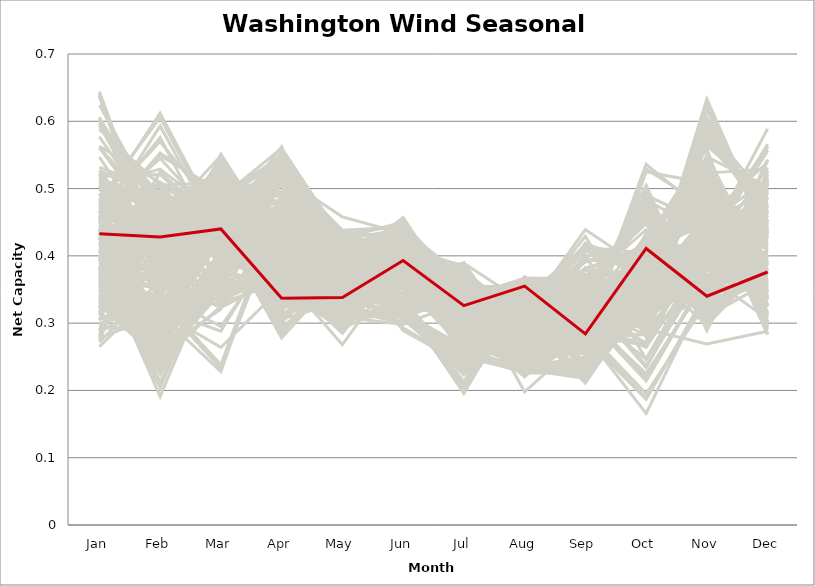
| Category | sample_001 | sample_002 | sample_003 | sample_004 | sample_005 | sample_006 | sample_007 | sample_008 | sample_009 | sample_010 | sample_011 | sample_012 | sample_013 | sample_014 | sample_015 | sample_016 | sample_017 | sample_018 | sample_019 | sample_020 | sample_021 | sample_022 | sample_023 | sample_024 | sample_025 | sample_026 | sample_027 | sample_028 | sample_029 | sample_030 | sample_031 | sample_032 | sample_033 | sample_034 | sample_035 | sample_036 | sample_037 | sample_038 | sample_039 | sample_040 | sample_041 | sample_042 | sample_043 | sample_044 | sample_045 | sample_046 | sample_047 | sample_048 | sample_049 | sample_050 | sample_051 | sample_052 | sample_053 | sample_054 | sample_055 | sample_056 | sample_057 | sample_058 | sample_059 | sample_060 | sample_061 | sample_062 | sample_063 | sample_064 | sample_065 | sample_066 | sample_067 | sample_068 | sample_069 | sample_070 | sample_071 | sample_072 | sample_073 | sample_074 | sample_075 | sample_076 | sample_077 | sample_078 | sample_079 | sample_080 | sample_081 | sample_082 | sample_083 | sample_084 | sample_085 | sample_086 | sample_087 | sample_088 | sample_089 | sample_090 | sample_091 | sample_092 | sample_093 | sample_094 | sample_095 | sample_096 | sample_097 | sample_098 | sample_099 | sample_100 | sample_101 | sample_102 | sample_103 | sample_104 | sample_105 | sample_106 | sample_107 | sample_108 | sample_109 | sample_110 | sample_111 | sample_112 | sample_113 | sample_114 | sample_115 | sample_116 | sample_117 | sample_118 | sample_119 | sample_120 | sample_121 | sample_122 | sample_123 | sample_124 | sample_125 | sample_126 | sample_127 | sample_128 | sample_129 | sample_130 | sample_131 | sample_132 | sample_133 | sample_134 | sample_135 | sample_136 | sample_137 | sample_138 | sample_139 | sample_140 | sample_141 | sample_142 | sample_143 | sample_144 | sample_145 | sample_146 | sample_147 | sample_148 | sample_149 | sample_150 | sample_151 | sample_152 | sample_153 | sample_154 | sample_155 | sample_156 | sample_157 | sample_158 | sample_159 | sample_160 | sample_161 | sample_162 | sample_163 | sample_164 | sample_165 | sample_166 | sample_167 | sample_168 | sample_169 | sample_170 | sample_171 | sample_172 | sample_173 | sample_174 | sample_175 | sample_176 | sample_177 | sample_178 | sample_179 | sample_180 | sample_181 | sample_182 | sample_183 | sample_184 | sample_185 | sample_186 | sample_187 | sample_188 | sample_189 | sample_190 | sample_191 | sample_192 | sample_193 | sample_194 | sample_195 | sample_196 | sample_197 | sample_198 | sample_199 | sample_200 | sample_201 | sample_202 | sample_203 | sample_204 | sample_205 | sample_206 | sample_207 | sample_208 | sample_209 | sample_210 | sample_211 | sample_212 | sample_213 | sample_214 | sample_215 | sample_216 | sample_217 | sample_218 | sample_219 | sample_220 | sample_221 | sample_222 | sample_223 | sample_224 | sample_225 | sample_226 | sample_227 | sample_228 | sample_229 | sample_230 | sample_231 | sample_232 | sample_233 | sample_234 | sample_235 | sample_236 | sample_237 | sample_238 | sample_239 | sample_240 | sample_241 | sample_242 | sample_243 | sample_244 | sample_245 | sample_246 | sample_247 | sample_248 | sample_250 | sample_249 |
|---|---|---|---|---|---|---|---|---|---|---|---|---|---|---|---|---|---|---|---|---|---|---|---|---|---|---|---|---|---|---|---|---|---|---|---|---|---|---|---|---|---|---|---|---|---|---|---|---|---|---|---|---|---|---|---|---|---|---|---|---|---|---|---|---|---|---|---|---|---|---|---|---|---|---|---|---|---|---|---|---|---|---|---|---|---|---|---|---|---|---|---|---|---|---|---|---|---|---|---|---|---|---|---|---|---|---|---|---|---|---|---|---|---|---|---|---|---|---|---|---|---|---|---|---|---|---|---|---|---|---|---|---|---|---|---|---|---|---|---|---|---|---|---|---|---|---|---|---|---|---|---|---|---|---|---|---|---|---|---|---|---|---|---|---|---|---|---|---|---|---|---|---|---|---|---|---|---|---|---|---|---|---|---|---|---|---|---|---|---|---|---|---|---|---|---|---|---|---|---|---|---|---|---|---|---|---|---|---|---|---|---|---|---|---|---|---|---|---|---|---|---|---|---|---|---|---|---|---|---|---|---|---|---|---|---|---|---|---|---|---|---|---|---|---|---|---|---|---|---|---|
| Jan | 0.468 | 0.458 | 0.605 | 0.367 | 0.527 | 0.448 | 0.451 | 0.355 | 0.475 | 0.392 | 0.601 | 0.457 | 0.377 | 0.64 | 0.376 | 0.362 | 0.279 | 0.296 | 0.37 | 0.577 | 0.398 | 0.455 | 0.36 | 0.407 | 0.431 | 0.316 | 0.46 | 0.504 | 0.367 | 0.597 | 0.338 | 0.503 | 0.272 | 0.406 | 0.415 | 0.461 | 0.384 | 0.349 | 0.308 | 0.282 | 0.469 | 0.452 | 0.353 | 0.398 | 0.636 | 0.428 | 0.378 | 0.312 | 0.355 | 0.393 | 0.445 | 0.46 | 0.432 | 0.501 | 0.338 | 0.305 | 0.324 | 0.563 | 0.464 | 0.527 | 0.328 | 0.328 | 0.411 | 0.561 | 0.393 | 0.435 | 0.411 | 0.375 | 0.332 | 0.491 | 0.384 | 0.413 | 0.48 | 0.373 | 0.411 | 0.624 | 0.38 | 0.508 | 0.483 | 0.327 | 0.39 | 0.464 | 0.346 | 0.352 | 0.43 | 0.473 | 0.386 | 0.359 | 0.395 | 0.475 | 0.477 | 0.439 | 0.372 | 0.385 | 0.518 | 0.597 | 0.36 | 0.334 | 0.5 | 0.402 | 0.4 | 0.47 | 0.595 | 0.492 | 0.447 | 0.475 | 0.438 | 0.422 | 0.265 | 0.335 | 0.395 | 0.366 | 0.329 | 0.321 | 0.34 | 0.367 | 0.547 | 0.471 | 0.481 | 0.426 | 0.606 | 0.404 | 0.397 | 0.439 | 0.384 | 0.355 | 0.513 | 0.402 | 0.39 | 0.409 | 0.362 | 0.377 | 0.473 | 0.406 | 0.452 | 0.478 | 0.466 | 0.472 | 0.312 | 0.382 | 0.418 | 0.287 | 0.469 | 0.373 | 0.35 | 0.335 | 0.444 | 0.407 | 0.643 | 0.434 | 0.372 | 0.427 | 0.638 | 0.3 | 0.382 | 0.485 | 0.306 | 0.485 | 0.478 | 0.467 | 0.343 | 0.275 | 0.355 | 0.517 | 0.454 | 0.371 | 0.476 | 0.366 | 0.362 | 0.383 | 0.351 | 0.417 | 0.42 | 0.506 | 0.354 | 0.344 | 0.455 | 0.603 | 0.424 | 0.388 | 0.367 | 0.345 | 0.411 | 0.44 | 0.315 | 0.499 | 0.483 | 0.33 | 0.45 | 0.442 | 0.288 | 0.304 | 0.588 | 0.43 | 0.361 | 0.385 | 0.395 | 0.369 | 0.419 | 0.29 | 0.332 | 0.343 | 0.455 | 0.455 | 0.382 | 0.515 | 0.402 | 0.359 | 0.406 | 0.451 | 0.35 | 0.4 | 0.316 | 0.393 | 0.456 | 0.278 | 0.493 | 0.294 | 0.42 | 0.375 | 0.644 | 0.523 | 0.349 | 0.449 | 0.561 | 0.492 | 0.44 | 0.448 | 0.498 | 0.349 | 0.51 | 0.39 | 0.381 | 0.593 | 0.488 | 0.317 | 0.46 | 0.532 | 0.337 | 0.367 | 0.323 | 0.429 | 0.409 | 0.521 | 0.312 | 0.441 | 0.375 | 0.466 | 0.605 | 0.433 |
| Feb | 0.404 | 0.431 | 0.404 | 0.351 | 0.484 | 0.553 | 0.286 | 0.471 | 0.612 | 0.411 | 0.46 | 0.295 | 0.314 | 0.37 | 0.479 | 0.273 | 0.475 | 0.347 | 0.437 | 0.445 | 0.411 | 0.283 | 0.247 | 0.376 | 0.345 | 0.343 | 0.443 | 0.529 | 0.267 | 0.465 | 0.461 | 0.412 | 0.364 | 0.284 | 0.406 | 0.296 | 0.288 | 0.275 | 0.331 | 0.49 | 0.427 | 0.509 | 0.358 | 0.191 | 0.423 | 0.258 | 0.486 | 0.449 | 0.336 | 0.415 | 0.283 | 0.253 | 0.478 | 0.496 | 0.244 | 0.491 | 0.49 | 0.509 | 0.545 | 0.411 | 0.286 | 0.244 | 0.275 | 0.461 | 0.492 | 0.272 | 0.462 | 0.226 | 0.246 | 0.482 | 0.302 | 0.475 | 0.446 | 0.353 | 0.429 | 0.462 | 0.364 | 0.494 | 0.606 | 0.455 | 0.419 | 0.576 | 0.344 | 0.493 | 0.476 | 0.57 | 0.378 | 0.342 | 0.322 | 0.379 | 0.428 | 0.314 | 0.328 | 0.266 | 0.521 | 0.489 | 0.419 | 0.379 | 0.484 | 0.388 | 0.418 | 0.401 | 0.428 | 0.375 | 0.472 | 0.456 | 0.239 | 0.385 | 0.354 | 0.488 | 0.477 | 0.43 | 0.453 | 0.458 | 0.325 | 0.429 | 0.409 | 0.443 | 0.402 | 0.289 | 0.438 | 0.369 | 0.21 | 0.408 | 0.282 | 0.28 | 0.457 | 0.381 | 0.295 | 0.342 | 0.462 | 0.387 | 0.4 | 0.373 | 0.424 | 0.397 | 0.289 | 0.463 | 0.476 | 0.304 | 0.387 | 0.336 | 0.418 | 0.524 | 0.3 | 0.432 | 0.45 | 0.314 | 0.375 | 0.245 | 0.293 | 0.29 | 0.391 | 0.321 | 0.429 | 0.39 | 0.317 | 0.504 | 0.436 | 0.505 | 0.262 | 0.474 | 0.318 | 0.459 | 0.446 | 0.26 | 0.46 | 0.26 | 0.294 | 0.462 | 0.339 | 0.394 | 0.434 | 0.417 | 0.499 | 0.334 | 0.461 | 0.434 | 0.413 | 0.359 | 0.269 | 0.439 | 0.403 | 0.298 | 0.411 | 0.426 | 0.392 | 0.323 | 0.413 | 0.495 | 0.45 | 0.483 | 0.505 | 0.453 | 0.271 | 0.275 | 0.224 | 0.281 | 0.258 | 0.444 | 0.438 | 0.279 | 0.45 | 0.549 | 0.204 | 0.466 | 0.307 | 0.299 | 0.408 | 0.593 | 0.314 | 0.362 | 0.477 | 0.415 | 0.466 | 0.313 | 0.399 | 0.287 | 0.231 | 0.509 | 0.401 | 0.428 | 0.246 | 0.401 | 0.438 | 0.454 | 0.299 | 0.483 | 0.488 | 0.491 | 0.4 | 0.367 | 0.371 | 0.482 | 0.45 | 0.475 | 0.445 | 0.496 | 0.451 | 0.46 | 0.476 | 0.287 | 0.212 | 0.372 | 0.384 | 0.247 | 0.418 | 0.472 | 0.459 | 0.428 |
| Mar | 0.414 | 0.42 | 0.333 | 0.505 | 0.42 | 0.492 | 0.357 | 0.436 | 0.441 | 0.508 | 0.348 | 0.37 | 0.459 | 0.323 | 0.438 | 0.443 | 0.521 | 0.471 | 0.441 | 0.372 | 0.422 | 0.352 | 0.474 | 0.449 | 0.455 | 0.295 | 0.455 | 0.459 | 0.474 | 0.347 | 0.437 | 0.494 | 0.323 | 0.438 | 0.43 | 0.369 | 0.425 | 0.483 | 0.233 | 0.425 | 0.491 | 0.462 | 0.497 | 0.406 | 0.342 | 0.361 | 0.453 | 0.437 | 0.518 | 0.444 | 0.343 | 0.347 | 0.514 | 0.415 | 0.384 | 0.433 | 0.425 | 0.362 | 0.446 | 0.505 | 0.408 | 0.346 | 0.372 | 0.395 | 0.386 | 0.45 | 0.484 | 0.408 | 0.36 | 0.42 | 0.431 | 0.393 | 0.478 | 0.55 | 0.457 | 0.343 | 0.534 | 0.459 | 0.434 | 0.439 | 0.456 | 0.403 | 0.48 | 0.423 | 0.526 | 0.457 | 0.503 | 0.488 | 0.436 | 0.525 | 0.488 | 0.363 | 0.428 | 0.389 | 0.439 | 0.393 | 0.441 | 0.546 | 0.427 | 0.44 | 0.475 | 0.501 | 0.358 | 0.551 | 0.438 | 0.434 | 0.355 | 0.434 | 0.327 | 0.427 | 0.392 | 0.429 | 0.428 | 0.449 | 0.487 | 0.434 | 0.503 | 0.461 | 0.525 | 0.453 | 0.337 | 0.45 | 0.412 | 0.414 | 0.397 | 0.442 | 0.465 | 0.44 | 0.429 | 0.433 | 0.45 | 0.512 | 0.514 | 0.434 | 0.464 | 0.525 | 0.359 | 0.477 | 0.42 | 0.422 | 0.43 | 0.238 | 0.479 | 0.443 | 0.452 | 0.418 | 0.469 | 0.429 | 0.34 | 0.325 | 0.443 | 0.368 | 0.33 | 0.288 | 0.449 | 0.516 | 0.264 | 0.456 | 0.486 | 0.509 | 0.38 | 0.417 | 0.457 | 0.404 | 0.519 | 0.461 | 0.52 | 0.458 | 0.449 | 0.433 | 0.54 | 0.45 | 0.438 | 0.544 | 0.42 | 0.527 | 0.476 | 0.359 | 0.434 | 0.44 | 0.395 | 0.456 | 0.429 | 0.434 | 0.498 | 0.457 | 0.534 | 0.478 | 0.48 | 0.509 | 0.549 | 0.494 | 0.352 | 0.465 | 0.379 | 0.393 | 0.406 | 0.432 | 0.321 | 0.473 | 0.449 | 0.404 | 0.532 | 0.496 | 0.411 | 0.458 | 0.44 | 0.474 | 0.449 | 0.428 | 0.488 | 0.446 | 0.422 | 0.421 | 0.488 | 0.228 | 0.486 | 0.407 | 0.367 | 0.39 | 0.337 | 0.429 | 0.356 | 0.488 | 0.421 | 0.438 | 0.44 | 0.485 | 0.416 | 0.413 | 0.512 | 0.491 | 0.53 | 0.399 | 0.458 | 0.515 | 0.48 | 0.434 | 0.441 | 0.424 | 0.449 | 0.435 | 0.409 | 0.54 | 0.491 | 0.347 | 0.426 | 0.486 | 0.34 | 0.44 |
| Apr | 0.389 | 0.345 | 0.376 | 0.308 | 0.449 | 0.516 | 0.511 | 0.35 | 0.494 | 0.373 | 0.362 | 0.556 | 0.322 | 0.37 | 0.377 | 0.562 | 0.365 | 0.338 | 0.375 | 0.367 | 0.325 | 0.516 | 0.513 | 0.393 | 0.388 | 0.424 | 0.536 | 0.463 | 0.532 | 0.375 | 0.351 | 0.437 | 0.436 | 0.383 | 0.326 | 0.539 | 0.543 | 0.528 | 0.466 | 0.411 | 0.547 | 0.437 | 0.311 | 0.348 | 0.365 | 0.509 | 0.394 | 0.379 | 0.38 | 0.285 | 0.533 | 0.515 | 0.432 | 0.479 | 0.378 | 0.424 | 0.385 | 0.381 | 0.438 | 0.478 | 0.428 | 0.359 | 0.549 | 0.373 | 0.439 | 0.392 | 0.406 | 0.341 | 0.367 | 0.486 | 0.343 | 0.388 | 0.529 | 0.386 | 0.307 | 0.366 | 0.392 | 0.448 | 0.454 | 0.368 | 0.397 | 0.46 | 0.348 | 0.367 | 0.416 | 0.457 | 0.395 | 0.34 | 0.407 | 0.423 | 0.521 | 0.533 | 0.545 | 0.534 | 0.466 | 0.405 | 0.385 | 0.368 | 0.434 | 0.301 | 0.357 | 0.462 | 0.359 | 0.411 | 0.543 | 0.532 | 0.518 | 0.324 | 0.454 | 0.428 | 0.45 | 0.387 | 0.395 | 0.35 | 0.323 | 0.328 | 0.458 | 0.53 | 0.413 | 0.392 | 0.369 | 0.292 | 0.363 | 0.354 | 0.543 | 0.548 | 0.43 | 0.284 | 0.346 | 0.391 | 0.391 | 0.363 | 0.441 | 0.401 | 0.525 | 0.415 | 0.517 | 0.433 | 0.373 | 0.403 | 0.323 | 0.483 | 0.547 | 0.388 | 0.32 | 0.455 | 0.534 | 0.415 | 0.386 | 0.537 | 0.538 | 0.52 | 0.361 | 0.435 | 0.419 | 0.447 | 0.353 | 0.409 | 0.543 | 0.474 | 0.351 | 0.443 | 0.318 | 0.44 | 0.404 | 0.505 | 0.405 | 0.537 | 0.552 | 0.417 | 0.356 | 0.288 | 0.325 | 0.417 | 0.393 | 0.37 | 0.496 | 0.368 | 0.325 | 0.278 | 0.535 | 0.315 | 0.327 | 0.402 | 0.454 | 0.518 | 0.415 | 0.328 | 0.531 | 0.42 | 0.358 | 0.377 | 0.363 | 0.493 | 0.353 | 0.535 | 0.354 | 0.544 | 0.546 | 0.483 | 0.306 | 0.446 | 0.415 | 0.504 | 0.331 | 0.421 | 0.394 | 0.312 | 0.431 | 0.474 | 0.294 | 0.295 | 0.426 | 0.325 | 0.548 | 0.486 | 0.444 | 0.445 | 0.527 | 0.469 | 0.4 | 0.435 | 0.358 | 0.541 | 0.422 | 0.444 | 0.403 | 0.515 | 0.442 | 0.426 | 0.487 | 0.38 | 0.387 | 0.356 | 0.538 | 0.368 | 0.55 | 0.467 | 0.339 | 0.36 | 0.363 | 0.411 | 0.355 | 0.406 | 0.372 | 0.534 | 0.387 | 0.56 | 0.388 | 0.337 |
| May | 0.384 | 0.355 | 0.313 | 0.371 | 0.403 | 0.414 | 0.392 | 0.355 | 0.398 | 0.336 | 0.343 | 0.38 | 0.404 | 0.305 | 0.373 | 0.332 | 0.326 | 0.341 | 0.37 | 0.336 | 0.345 | 0.394 | 0.34 | 0.353 | 0.375 | 0.304 | 0.427 | 0.374 | 0.355 | 0.329 | 0.291 | 0.388 | 0.417 | 0.392 | 0.341 | 0.371 | 0.344 | 0.342 | 0.326 | 0.337 | 0.428 | 0.371 | 0.384 | 0.349 | 0.322 | 0.385 | 0.383 | 0.322 | 0.347 | 0.383 | 0.387 | 0.386 | 0.351 | 0.4 | 0.349 | 0.336 | 0.331 | 0.318 | 0.365 | 0.391 | 0.374 | 0.297 | 0.363 | 0.319 | 0.304 | 0.385 | 0.34 | 0.352 | 0.301 | 0.39 | 0.395 | 0.308 | 0.421 | 0.307 | 0.382 | 0.338 | 0.346 | 0.375 | 0.397 | 0.306 | 0.377 | 0.365 | 0.349 | 0.369 | 0.355 | 0.367 | 0.345 | 0.349 | 0.393 | 0.371 | 0.436 | 0.384 | 0.34 | 0.36 | 0.388 | 0.332 | 0.386 | 0.308 | 0.422 | 0.386 | 0.343 | 0.341 | 0.343 | 0.4 | 0.427 | 0.435 | 0.392 | 0.346 | 0.415 | 0.321 | 0.305 | 0.378 | 0.32 | 0.344 | 0.346 | 0.327 | 0.398 | 0.438 | 0.396 | 0.393 | 0.334 | 0.36 | 0.36 | 0.35 | 0.368 | 0.328 | 0.346 | 0.387 | 0.394 | 0.382 | 0.387 | 0.342 | 0.342 | 0.37 | 0.422 | 0.346 | 0.384 | 0.34 | 0.293 | 0.395 | 0.335 | 0.321 | 0.423 | 0.365 | 0.403 | 0.386 | 0.419 | 0.401 | 0.34 | 0.434 | 0.339 | 0.362 | 0.32 | 0.306 | 0.378 | 0.344 | 0.309 | 0.367 | 0.413 | 0.381 | 0.317 | 0.344 | 0.413 | 0.392 | 0.355 | 0.333 | 0.357 | 0.339 | 0.354 | 0.383 | 0.324 | 0.393 | 0.352 | 0.379 | 0.298 | 0.285 | 0.407 | 0.328 | 0.37 | 0.378 | 0.364 | 0.34 | 0.335 | 0.388 | 0.356 | 0.458 | 0.368 | 0.348 | 0.404 | 0.358 | 0.329 | 0.349 | 0.322 | 0.344 | 0.33 | 0.351 | 0.363 | 0.329 | 0.428 | 0.356 | 0.332 | 0.385 | 0.364 | 0.404 | 0.359 | 0.367 | 0.394 | 0.339 | 0.368 | 0.394 | 0.362 | 0.35 | 0.317 | 0.356 | 0.418 | 0.32 | 0.38 | 0.376 | 0.389 | 0.317 | 0.292 | 0.417 | 0.291 | 0.41 | 0.405 | 0.373 | 0.395 | 0.404 | 0.39 | 0.317 | 0.344 | 0.344 | 0.34 | 0.318 | 0.431 | 0.336 | 0.429 | 0.41 | 0.323 | 0.351 | 0.342 | 0.404 | 0.356 | 0.381 | 0.268 | 0.397 | 0.389 | 0.424 | 0.332 | 0.338 |
| Jun | 0.42 | 0.363 | 0.309 | 0.327 | 0.384 | 0.419 | 0.428 | 0.379 | 0.43 | 0.366 | 0.327 | 0.438 | 0.332 | 0.314 | 0.378 | 0.419 | 0.366 | 0.333 | 0.371 | 0.309 | 0.358 | 0.446 | 0.41 | 0.378 | 0.359 | 0.418 | 0.41 | 0.45 | 0.418 | 0.321 | 0.402 | 0.42 | 0.435 | 0.308 | 0.385 | 0.427 | 0.421 | 0.406 | 0.407 | 0.357 | 0.403 | 0.431 | 0.328 | 0.393 | 0.31 | 0.433 | 0.373 | 0.388 | 0.365 | 0.339 | 0.457 | 0.435 | 0.419 | 0.385 | 0.426 | 0.371 | 0.398 | 0.371 | 0.438 | 0.432 | 0.393 | 0.416 | 0.408 | 0.373 | 0.327 | 0.315 | 0.365 | 0.396 | 0.424 | 0.37 | 0.326 | 0.358 | 0.4 | 0.401 | 0.335 | 0.311 | 0.365 | 0.417 | 0.427 | 0.399 | 0.345 | 0.44 | 0.322 | 0.376 | 0.425 | 0.451 | 0.36 | 0.32 | 0.315 | 0.403 | 0.427 | 0.443 | 0.416 | 0.415 | 0.386 | 0.378 | 0.352 | 0.384 | 0.385 | 0.341 | 0.364 | 0.366 | 0.309 | 0.425 | 0.45 | 0.422 | 0.424 | 0.376 | 0.44 | 0.396 | 0.332 | 0.361 | 0.384 | 0.385 | 0.323 | 0.373 | 0.43 | 0.443 | 0.399 | 0.303 | 0.316 | 0.359 | 0.403 | 0.36 | 0.405 | 0.418 | 0.411 | 0.322 | 0.318 | 0.333 | 0.381 | 0.359 | 0.387 | 0.361 | 0.418 | 0.372 | 0.43 | 0.36 | 0.4 | 0.341 | 0.378 | 0.397 | 0.421 | 0.383 | 0.33 | 0.393 | 0.431 | 0.293 | 0.306 | 0.403 | 0.418 | 0.445 | 0.3 | 0.424 | 0.354 | 0.369 | 0.298 | 0.42 | 0.417 | 0.41 | 0.433 | 0.363 | 0.327 | 0.379 | 0.417 | 0.408 | 0.419 | 0.42 | 0.426 | 0.362 | 0.365 | 0.329 | 0.36 | 0.399 | 0.407 | 0.395 | 0.428 | 0.301 | 0.343 | 0.33 | 0.409 | 0.401 | 0.384 | 0.32 | 0.407 | 0.433 | 0.399 | 0.326 | 0.417 | 0.392 | 0.375 | 0.371 | 0.341 | 0.39 | 0.425 | 0.412 | 0.387 | 0.416 | 0.417 | 0.401 | 0.394 | 0.371 | 0.425 | 0.417 | 0.392 | 0.42 | 0.306 | 0.323 | 0.384 | 0.43 | 0.323 | 0.371 | 0.366 | 0.352 | 0.427 | 0.408 | 0.43 | 0.407 | 0.448 | 0.316 | 0.336 | 0.379 | 0.429 | 0.439 | 0.376 | 0.393 | 0.316 | 0.434 | 0.378 | 0.345 | 0.338 | 0.351 | 0.368 | 0.38 | 0.446 | 0.391 | 0.412 | 0.394 | 0.401 | 0.371 | 0.396 | 0.289 | 0.395 | 0.404 | 0.393 | 0.419 | 0.342 | 0.44 | 0.333 | 0.393 |
| Jul | 0.312 | 0.331 | 0.377 | 0.236 | 0.337 | 0.334 | 0.332 | 0.295 | 0.29 | 0.308 | 0.348 | 0.301 | 0.196 | 0.349 | 0.287 | 0.272 | 0.27 | 0.235 | 0.3 | 0.34 | 0.332 | 0.319 | 0.283 | 0.284 | 0.295 | 0.329 | 0.369 | 0.311 | 0.294 | 0.365 | 0.328 | 0.27 | 0.296 | 0.23 | 0.326 | 0.297 | 0.298 | 0.275 | 0.345 | 0.297 | 0.381 | 0.336 | 0.207 | 0.247 | 0.369 | 0.314 | 0.291 | 0.296 | 0.285 | 0.346 | 0.319 | 0.329 | 0.25 | 0.364 | 0.272 | 0.308 | 0.285 | 0.282 | 0.292 | 0.275 | 0.345 | 0.302 | 0.307 | 0.26 | 0.325 | 0.261 | 0.311 | 0.248 | 0.303 | 0.376 | 0.213 | 0.262 | 0.375 | 0.292 | 0.335 | 0.351 | 0.269 | 0.356 | 0.28 | 0.334 | 0.289 | 0.275 | 0.24 | 0.308 | 0.256 | 0.297 | 0.292 | 0.23 | 0.223 | 0.29 | 0.362 | 0.304 | 0.283 | 0.31 | 0.378 | 0.267 | 0.29 | 0.278 | 0.343 | 0.351 | 0.316 | 0.324 | 0.352 | 0.285 | 0.348 | 0.355 | 0.353 | 0.323 | 0.284 | 0.307 | 0.321 | 0.287 | 0.317 | 0.281 | 0.245 | 0.329 | 0.281 | 0.356 | 0.263 | 0.25 | 0.355 | 0.338 | 0.25 | 0.341 | 0.308 | 0.28 | 0.348 | 0.352 | 0.205 | 0.212 | 0.293 | 0.288 | 0.32 | 0.294 | 0.372 | 0.313 | 0.313 | 0.336 | 0.343 | 0.204 | 0.338 | 0.354 | 0.367 | 0.304 | 0.196 | 0.361 | 0.337 | 0.239 | 0.365 | 0.372 | 0.277 | 0.309 | 0.381 | 0.332 | 0.284 | 0.327 | 0.333 | 0.335 | 0.352 | 0.36 | 0.3 | 0.304 | 0.198 | 0.389 | 0.249 | 0.283 | 0.253 | 0.264 | 0.259 | 0.286 | 0.292 | 0.354 | 0.329 | 0.279 | 0.352 | 0.28 | 0.328 | 0.39 | 0.343 | 0.345 | 0.315 | 0.323 | 0.332 | 0.252 | 0.28 | 0.359 | 0.279 | 0.248 | 0.365 | 0.255 | 0.279 | 0.274 | 0.311 | 0.298 | 0.28 | 0.307 | 0.268 | 0.27 | 0.367 | 0.301 | 0.317 | 0.359 | 0.258 | 0.327 | 0.272 | 0.363 | 0.228 | 0.254 | 0.276 | 0.291 | 0.236 | 0.347 | 0.298 | 0.336 | 0.349 | 0.344 | 0.271 | 0.334 | 0.338 | 0.325 | 0.353 | 0.346 | 0.307 | 0.36 | 0.362 | 0.369 | 0.265 | 0.343 | 0.367 | 0.318 | 0.332 | 0.286 | 0.282 | 0.28 | 0.351 | 0.29 | 0.385 | 0.341 | 0.34 | 0.301 | 0.289 | 0.239 | 0.251 | 0.289 | 0.284 | 0.366 | 0.302 | 0.367 | 0.364 | 0.326 |
| Aug | 0.347 | 0.343 | 0.246 | 0.336 | 0.315 | 0.291 | 0.327 | 0.325 | 0.323 | 0.292 | 0.27 | 0.304 | 0.36 | 0.252 | 0.295 | 0.342 | 0.246 | 0.342 | 0.314 | 0.295 | 0.365 | 0.293 | 0.368 | 0.345 | 0.327 | 0.236 | 0.267 | 0.314 | 0.352 | 0.271 | 0.367 | 0.236 | 0.299 | 0.354 | 0.35 | 0.305 | 0.314 | 0.343 | 0.225 | 0.313 | 0.272 | 0.304 | 0.361 | 0.276 | 0.24 | 0.315 | 0.3 | 0.313 | 0.257 | 0.353 | 0.286 | 0.308 | 0.229 | 0.307 | 0.266 | 0.313 | 0.3 | 0.309 | 0.308 | 0.236 | 0.266 | 0.268 | 0.322 | 0.326 | 0.222 | 0.322 | 0.254 | 0.276 | 0.249 | 0.303 | 0.35 | 0.23 | 0.275 | 0.237 | 0.343 | 0.265 | 0.276 | 0.32 | 0.324 | 0.35 | 0.325 | 0.328 | 0.332 | 0.306 | 0.235 | 0.324 | 0.276 | 0.332 | 0.322 | 0.235 | 0.309 | 0.307 | 0.317 | 0.331 | 0.306 | 0.321 | 0.321 | 0.237 | 0.324 | 0.353 | 0.267 | 0.271 | 0.275 | 0.233 | 0.276 | 0.282 | 0.287 | 0.365 | 0.268 | 0.297 | 0.23 | 0.3 | 0.309 | 0.319 | 0.355 | 0.366 | 0.236 | 0.301 | 0.231 | 0.315 | 0.267 | 0.359 | 0.269 | 0.334 | 0.309 | 0.35 | 0.333 | 0.344 | 0.359 | 0.32 | 0.301 | 0.28 | 0.295 | 0.321 | 0.282 | 0.262 | 0.307 | 0.27 | 0.337 | 0.326 | 0.367 | 0.222 | 0.28 | 0.31 | 0.348 | 0.198 | 0.296 | 0.319 | 0.243 | 0.261 | 0.355 | 0.32 | 0.251 | 0.227 | 0.317 | 0.271 | 0.277 | 0.322 | 0.294 | 0.292 | 0.26 | 0.307 | 0.367 | 0.33 | 0.229 | 0.362 | 0.226 | 0.369 | 0.356 | 0.302 | 0.243 | 0.355 | 0.359 | 0.233 | 0.316 | 0.254 | 0.316 | 0.258 | 0.34 | 0.346 | 0.328 | 0.363 | 0.359 | 0.299 | 0.268 | 0.315 | 0.23 | 0.357 | 0.286 | 0.23 | 0.246 | 0.238 | 0.305 | 0.287 | 0.262 | 0.332 | 0.28 | 0.344 | 0.27 | 0.231 | 0.363 | 0.256 | 0.234 | 0.297 | 0.282 | 0.334 | 0.316 | 0.352 | 0.335 | 0.344 | 0.345 | 0.356 | 0.22 | 0.361 | 0.288 | 0.222 | 0.248 | 0.268 | 0.291 | 0.224 | 0.247 | 0.329 | 0.275 | 0.284 | 0.324 | 0.325 | 0.319 | 0.304 | 0.298 | 0.225 | 0.27 | 0.293 | 0.273 | 0.344 | 0.287 | 0.251 | 0.258 | 0.302 | 0.362 | 0.317 | 0.335 | 0.332 | 0.273 | 0.234 | 0.225 | 0.277 | 0.332 | 0.268 | 0.265 | 0.355 |
| Sep | 0.317 | 0.273 | 0.273 | 0.344 | 0.238 | 0.283 | 0.349 | 0.379 | 0.265 | 0.278 | 0.254 | 0.322 | 0.343 | 0.299 | 0.362 | 0.31 | 0.278 | 0.348 | 0.364 | 0.326 | 0.349 | 0.35 | 0.301 | 0.33 | 0.329 | 0.3 | 0.294 | 0.261 | 0.296 | 0.271 | 0.366 | 0.24 | 0.32 | 0.301 | 0.286 | 0.317 | 0.314 | 0.294 | 0.278 | 0.408 | 0.309 | 0.258 | 0.342 | 0.327 | 0.272 | 0.353 | 0.354 | 0.439 | 0.284 | 0.342 | 0.358 | 0.351 | 0.233 | 0.22 | 0.322 | 0.396 | 0.419 | 0.311 | 0.258 | 0.226 | 0.293 | 0.315 | 0.31 | 0.34 | 0.401 | 0.295 | 0.29 | 0.317 | 0.306 | 0.211 | 0.331 | 0.382 | 0.309 | 0.268 | 0.372 | 0.261 | 0.263 | 0.233 | 0.293 | 0.366 | 0.328 | 0.277 | 0.332 | 0.401 | 0.245 | 0.266 | 0.272 | 0.344 | 0.295 | 0.25 | 0.267 | 0.33 | 0.312 | 0.302 | 0.215 | 0.315 | 0.342 | 0.264 | 0.242 | 0.342 | 0.295 | 0.285 | 0.288 | 0.243 | 0.293 | 0.288 | 0.352 | 0.294 | 0.317 | 0.413 | 0.344 | 0.36 | 0.416 | 0.413 | 0.35 | 0.36 | 0.22 | 0.299 | 0.218 | 0.277 | 0.27 | 0.328 | 0.312 | 0.27 | 0.297 | 0.317 | 0.227 | 0.378 | 0.317 | 0.308 | 0.352 | 0.271 | 0.29 | 0.329 | 0.293 | 0.311 | 0.338 | 0.31 | 0.415 | 0.316 | 0.296 | 0.293 | 0.297 | 0.382 | 0.334 | 0.279 | 0.287 | 0.284 | 0.274 | 0.356 | 0.318 | 0.319 | 0.276 | 0.288 | 0.322 | 0.278 | 0.295 | 0.254 | 0.283 | 0.284 | 0.343 | 0.416 | 0.333 | 0.229 | 0.231 | 0.294 | 0.226 | 0.306 | 0.307 | 0.348 | 0.292 | 0.35 | 0.358 | 0.222 | 0.429 | 0.282 | 0.271 | 0.272 | 0.35 | 0.37 | 0.311 | 0.358 | 0.29 | 0.286 | 0.294 | 0.271 | 0.232 | 0.363 | 0.295 | 0.243 | 0.265 | 0.282 | 0.316 | 0.318 | 0.325 | 0.303 | 0.301 | 0.309 | 0.361 | 0.299 | 0.367 | 0.271 | 0.236 | 0.27 | 0.343 | 0.255 | 0.285 | 0.351 | 0.318 | 0.279 | 0.354 | 0.322 | 0.304 | 0.365 | 0.279 | 0.296 | 0.257 | 0.291 | 0.347 | 0.339 | 0.29 | 0.238 | 0.331 | 0.303 | 0.233 | 0.216 | 0.283 | 0.264 | 0.212 | 0.315 | 0.283 | 0.285 | 0.263 | 0.32 | 0.28 | 0.281 | 0.31 | 0.236 | 0.373 | 0.391 | 0.407 | 0.288 | 0.306 | 0.248 | 0.274 | 0.367 | 0.34 | 0.296 | 0.264 | 0.284 |
| Oct | 0.291 | 0.431 | 0.35 | 0.374 | 0.342 | 0.416 | 0.336 | 0.416 | 0.306 | 0.35 | 0.348 | 0.34 | 0.39 | 0.411 | 0.455 | 0.346 | 0.283 | 0.388 | 0.448 | 0.319 | 0.336 | 0.328 | 0.372 | 0.482 | 0.492 | 0.341 | 0.381 | 0.314 | 0.363 | 0.339 | 0.31 | 0.357 | 0.483 | 0.404 | 0.415 | 0.341 | 0.354 | 0.373 | 0.36 | 0.373 | 0.388 | 0.323 | 0.383 | 0.428 | 0.347 | 0.328 | 0.461 | 0.378 | 0.413 | 0.399 | 0.337 | 0.328 | 0.413 | 0.332 | 0.368 | 0.382 | 0.382 | 0.298 | 0.314 | 0.363 | 0.529 | 0.343 | 0.344 | 0.268 | 0.246 | 0.375 | 0.351 | 0.4 | 0.357 | 0.349 | 0.379 | 0.288 | 0.389 | 0.416 | 0.377 | 0.338 | 0.426 | 0.31 | 0.323 | 0.31 | 0.473 | 0.321 | 0.377 | 0.4 | 0.42 | 0.329 | 0.433 | 0.383 | 0.39 | 0.391 | 0.402 | 0.334 | 0.366 | 0.366 | 0.341 | 0.271 | 0.467 | 0.416 | 0.351 | 0.379 | 0.342 | 0.188 | 0.355 | 0.386 | 0.405 | 0.377 | 0.311 | 0.419 | 0.49 | 0.404 | 0.237 | 0.439 | 0.375 | 0.387 | 0.37 | 0.32 | 0.362 | 0.399 | 0.392 | 0.359 | 0.347 | 0.407 | 0.416 | 0.421 | 0.37 | 0.345 | 0.328 | 0.374 | 0.38 | 0.385 | 0.459 | 0.428 | 0.195 | 0.505 | 0.396 | 0.214 | 0.335 | 0.225 | 0.297 | 0.42 | 0.402 | 0.349 | 0.37 | 0.408 | 0.376 | 0.369 | 0.421 | 0.387 | 0.422 | 0.298 | 0.356 | 0.329 | 0.37 | 0.353 | 0.484 | 0.187 | 0.268 | 0.321 | 0.404 | 0.413 | 0.343 | 0.361 | 0.382 | 0.353 | 0.408 | 0.368 | 0.419 | 0.35 | 0.356 | 0.475 | 0.415 | 0.384 | 0.33 | 0.402 | 0.279 | 0.416 | 0.406 | 0.339 | 0.361 | 0.376 | 0.369 | 0.319 | 0.399 | 0.391 | 0.408 | 0.397 | 0.411 | 0.362 | 0.386 | 0.433 | 0.308 | 0.267 | 0.315 | 0.219 | 0.347 | 0.365 | 0.422 | 0.342 | 0.299 | 0.416 | 0.292 | 0.525 | 0.414 | 0.408 | 0.402 | 0.33 | 0.379 | 0.374 | 0.496 | 0.319 | 0.35 | 0.411 | 0.264 | 0.318 | 0.408 | 0.379 | 0.351 | 0.536 | 0.34 | 0.234 | 0.432 | 0.327 | 0.359 | 0.397 | 0.355 | 0.328 | 0.366 | 0.402 | 0.342 | 0.247 | 0.166 | 0.404 | 0.426 | 0.283 | 0.412 | 0.284 | 0.379 | 0.343 | 0.304 | 0.408 | 0.386 | 0.393 | 0.422 | 0.402 | 0.398 | 0.309 | 0.456 | 0.389 | 0.34 | 0.411 |
| Nov | 0.269 | 0.373 | 0.597 | 0.549 | 0.386 | 0.462 | 0.414 | 0.307 | 0.393 | 0.461 | 0.605 | 0.44 | 0.503 | 0.547 | 0.323 | 0.392 | 0.412 | 0.48 | 0.305 | 0.601 | 0.349 | 0.411 | 0.385 | 0.289 | 0.304 | 0.388 | 0.503 | 0.426 | 0.379 | 0.626 | 0.378 | 0.418 | 0.434 | 0.511 | 0.335 | 0.456 | 0.395 | 0.385 | 0.352 | 0.399 | 0.516 | 0.405 | 0.521 | 0.364 | 0.625 | 0.408 | 0.326 | 0.352 | 0.454 | 0.303 | 0.434 | 0.425 | 0.471 | 0.409 | 0.364 | 0.396 | 0.359 | 0.593 | 0.394 | 0.419 | 0.472 | 0.36 | 0.435 | 0.573 | 0.386 | 0.529 | 0.46 | 0.344 | 0.361 | 0.437 | 0.518 | 0.356 | 0.51 | 0.484 | 0.339 | 0.617 | 0.465 | 0.414 | 0.4 | 0.37 | 0.306 | 0.391 | 0.499 | 0.305 | 0.464 | 0.411 | 0.459 | 0.51 | 0.512 | 0.415 | 0.458 | 0.449 | 0.421 | 0.426 | 0.418 | 0.591 | 0.328 | 0.482 | 0.39 | 0.297 | 0.464 | 0.341 | 0.587 | 0.402 | 0.482 | 0.494 | 0.397 | 0.328 | 0.448 | 0.391 | 0.383 | 0.318 | 0.367 | 0.332 | 0.487 | 0.388 | 0.44 | 0.491 | 0.415 | 0.541 | 0.619 | 0.305 | 0.335 | 0.37 | 0.433 | 0.392 | 0.428 | 0.333 | 0.517 | 0.522 | 0.302 | 0.467 | 0.332 | 0.301 | 0.497 | 0.369 | 0.432 | 0.362 | 0.338 | 0.559 | 0.323 | 0.341 | 0.517 | 0.326 | 0.495 | 0.429 | 0.482 | 0.53 | 0.564 | 0.442 | 0.394 | 0.394 | 0.57 | 0.394 | 0.339 | 0.347 | 0.457 | 0.407 | 0.493 | 0.466 | 0.361 | 0.381 | 0.497 | 0.402 | 0.447 | 0.388 | 0.449 | 0.409 | 0.384 | 0.355 | 0.467 | 0.314 | 0.363 | 0.452 | 0.365 | 0.512 | 0.476 | 0.601 | 0.347 | 0.309 | 0.417 | 0.403 | 0.327 | 0.533 | 0.421 | 0.462 | 0.451 | 0.489 | 0.487 | 0.476 | 0.42 | 0.43 | 0.592 | 0.371 | 0.4 | 0.43 | 0.356 | 0.392 | 0.404 | 0.445 | 0.387 | 0.508 | 0.453 | 0.472 | 0.333 | 0.411 | 0.539 | 0.488 | 0.315 | 0.384 | 0.496 | 0.31 | 0.402 | 0.352 | 0.486 | 0.378 | 0.408 | 0.462 | 0.386 | 0.395 | 0.523 | 0.388 | 0.358 | 0.494 | 0.393 | 0.437 | 0.526 | 0.483 | 0.423 | 0.403 | 0.352 | 0.469 | 0.455 | 0.579 | 0.469 | 0.407 | 0.518 | 0.395 | 0.379 | 0.307 | 0.327 | 0.525 | 0.357 | 0.41 | 0.519 | 0.396 | 0.323 | 0.477 | 0.633 | 0.34 |
| Dec | 0.288 | 0.359 | 0.437 | 0.374 | 0.505 | 0.348 | 0.436 | 0.52 | 0.403 | 0.44 | 0.451 | 0.473 | 0.345 | 0.503 | 0.513 | 0.449 | 0.424 | 0.355 | 0.506 | 0.44 | 0.394 | 0.444 | 0.448 | 0.464 | 0.448 | 0.363 | 0.301 | 0.464 | 0.467 | 0.434 | 0.398 | 0.589 | 0.562 | 0.326 | 0.36 | 0.465 | 0.44 | 0.468 | 0.361 | 0.499 | 0.296 | 0.444 | 0.363 | 0.437 | 0.432 | 0.446 | 0.511 | 0.508 | 0.431 | 0.411 | 0.442 | 0.442 | 0.415 | 0.495 | 0.396 | 0.512 | 0.494 | 0.466 | 0.423 | 0.566 | 0.423 | 0.389 | 0.461 | 0.484 | 0.396 | 0.354 | 0.46 | 0.432 | 0.387 | 0.48 | 0.316 | 0.434 | 0.3 | 0.417 | 0.408 | 0.437 | 0.421 | 0.449 | 0.394 | 0.39 | 0.494 | 0.4 | 0.386 | 0.526 | 0.437 | 0.429 | 0.4 | 0.39 | 0.336 | 0.504 | 0.303 | 0.463 | 0.428 | 0.443 | 0.483 | 0.485 | 0.465 | 0.418 | 0.516 | 0.391 | 0.432 | 0.506 | 0.447 | 0.531 | 0.283 | 0.29 | 0.434 | 0.368 | 0.514 | 0.506 | 0.435 | 0.51 | 0.474 | 0.507 | 0.378 | 0.386 | 0.557 | 0.285 | 0.556 | 0.338 | 0.426 | 0.39 | 0.445 | 0.36 | 0.45 | 0.427 | 0.451 | 0.397 | 0.3 | 0.326 | 0.514 | 0.412 | 0.513 | 0.437 | 0.294 | 0.439 | 0.461 | 0.373 | 0.423 | 0.313 | 0.377 | 0.37 | 0.324 | 0.543 | 0.338 | 0.461 | 0.341 | 0.346 | 0.485 | 0.432 | 0.448 | 0.467 | 0.464 | 0.362 | 0.486 | 0.522 | 0.539 | 0.47 | 0.334 | 0.399 | 0.407 | 0.514 | 0.338 | 0.474 | 0.45 | 0.478 | 0.467 | 0.449 | 0.46 | 0.498 | 0.446 | 0.394 | 0.4 | 0.494 | 0.449 | 0.385 | 0.341 | 0.449 | 0.42 | 0.399 | 0.428 | 0.392 | 0.362 | 0.359 | 0.397 | 0.293 | 0.479 | 0.377 | 0.308 | 0.426 | 0.403 | 0.427 | 0.457 | 0.306 | 0.413 | 0.436 | 0.407 | 0.445 | 0.424 | 0.389 | 0.383 | 0.43 | 0.451 | 0.355 | 0.453 | 0.428 | 0.34 | 0.38 | 0.476 | 0.379 | 0.371 | 0.36 | 0.455 | 0.379 | 0.328 | 0.374 | 0.562 | 0.416 | 0.438 | 0.454 | 0.529 | 0.496 | 0.389 | 0.314 | 0.456 | 0.456 | 0.351 | 0.347 | 0.469 | 0.455 | 0.543 | 0.399 | 0.413 | 0.452 | 0.298 | 0.428 | 0.311 | 0.508 | 0.404 | 0.527 | 0.516 | 0.326 | 0.428 | 0.501 | 0.39 | 0.427 | 0.474 | 0.336 | 0.428 | 0.376 |